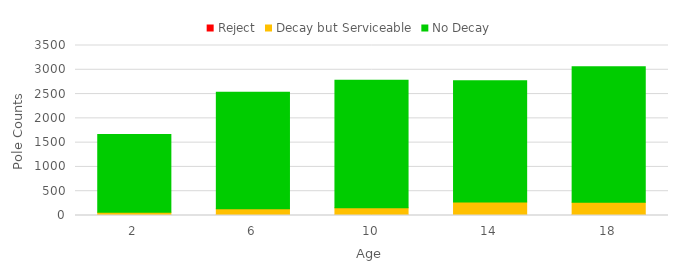
| Category | Reject | Decay but Serviceable | No Decay |
|---|---|---|---|
| 2 | 3 | 62 | 1604 |
| 6 | 8 | 130 | 2401 |
| 10 | 4 | 153 | 2629 |
| 14 | 6 | 270 | 2498 |
| 18 | 8 | 266 | 2788 |